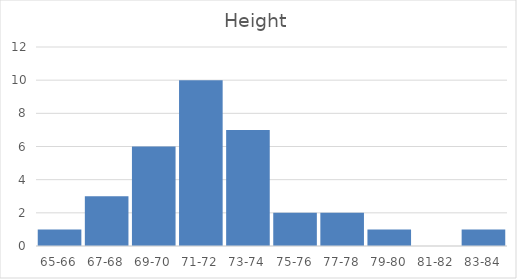
| Category | Series 0 |
|---|---|
| 65-66 | 1 |
| 67-68 | 3 |
| 69-70 | 6 |
| 71-72 | 10 |
| 73-74 | 7 |
| 75-76 | 2 |
| 77-78 | 2 |
| 79-80 | 1 |
| 81-82 | 0 |
| 83-84 | 1 |